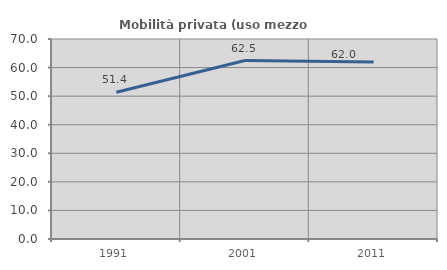
| Category | Mobilità privata (uso mezzo privato) |
|---|---|
| 1991.0 | 51.369 |
| 2001.0 | 62.46 |
| 2011.0 | 61.977 |